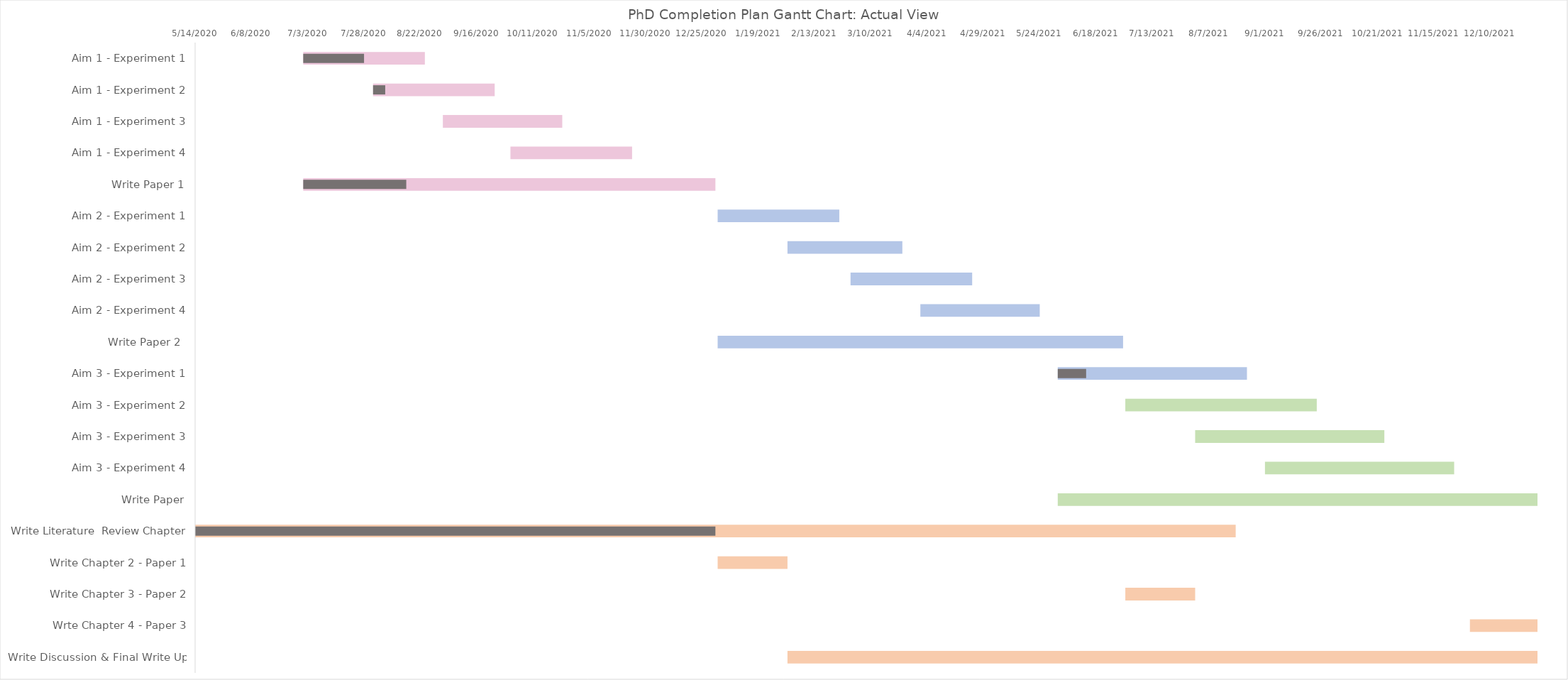
| Category | Start Date | # Days |
|---|---|---|
| Aim 1 - Experiment 1 | 7/1/20 | 54 |
| Aim 1 - Experiment 2 | 8/1/20 | 54 |
| Aim 1 - Experiment 3 | 9/1/20 | 53 |
| Aim 1 - Experiment 4 | 10/1/20 | 54 |
| Write Paper 1 | 7/1/20 | 183 |
| Aim 2 - Experiment 1 | 1/1/21 | 54 |
| Aim 2 - Experiment 2 | 2/1/21 | 51 |
| Aim 2 - Experiment 3 | 3/1/21 | 54 |
| Aim 2 - Experiment 4 | 4/1/21 | 53 |
| Write Paper 2  | 1/1/21 | 180 |
| Aim 3 - Experiment 1 | 6/1/21 | 84 |
| Aim 3 - Experiment 2 | 7/1/21 | 85 |
| Aim 3 - Experiment 3 | 8/1/21 | 84 |
| Aim 3 - Experiment 4 | 9/1/21 | 84 |
| Write Paper | 6/1/21 | 213 |
| Write Literature  Review Chapter | 5/14/20 | 462 |
| Write Chapter 2 - Paper 1 | 1/1/21 | 31 |
| Write Chapter 3 - Paper 2 | 7/1/21 | 31 |
| Wrte Chapter 4 - Paper 3 | 12/1/21 | 30 |
| Write Discussion & Final Write Up | 2/1/21 | 333 |